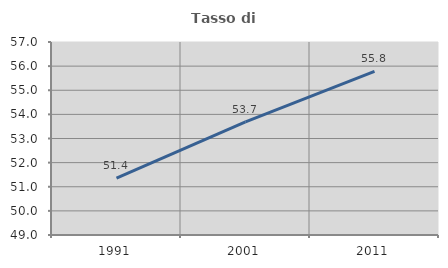
| Category | Tasso di occupazione   |
|---|---|
| 1991.0 | 51.361 |
| 2001.0 | 53.687 |
| 2011.0 | 55.778 |